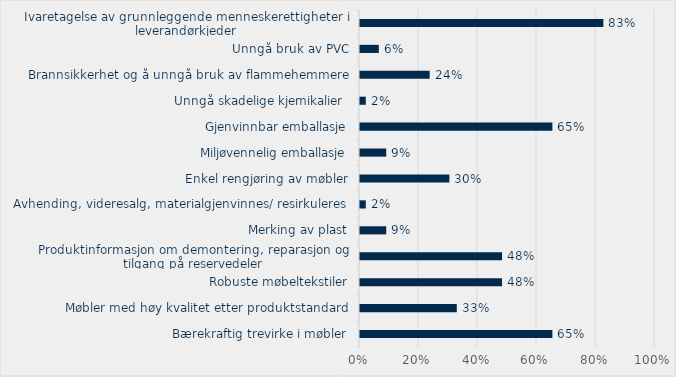
| Category | Prosent |
|---|---|
| Bærekraftig trevirke i møbler | 0.652 |
| Møbler med høy kvalitet etter produktstandard | 0.328 |
| Robuste møbeltekstiler | 0.481 |
| Produktinformasjon om demontering, reparasjon og tilgang på reservedeler | 0.481 |
| Merking av plast | 0.089 |
| Avhending, videresalg, materialgjenvinnes/ resirkuleres | 0.02 |
| Enkel rengjøring av møbler | 0.303 |
| Miljøvennelig emballasje | 0.089 |
| Gjenvinnbar emballasje | 0.652 |
| Unngå skadelige kjemikalier  | 0.02 |
| Brannsikkerhet og å unngå bruk av flammehemmere | 0.236 |
| Unngå bruk av PVC | 0.064 |
| Ivaretagelse av grunnleggende menneskerettigheter i leverandørkjeder | 0.825 |